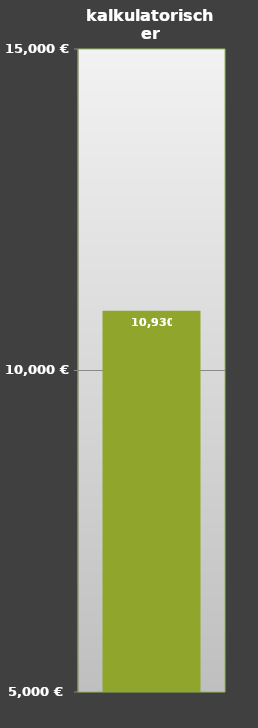
| Category | Series 0 |
|---|---|
| 0 | 10930 |